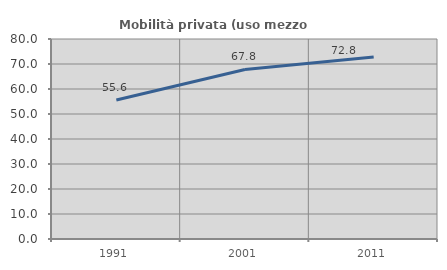
| Category | Mobilità privata (uso mezzo privato) |
|---|---|
| 1991.0 | 55.628 |
| 2001.0 | 67.834 |
| 2011.0 | 72.765 |